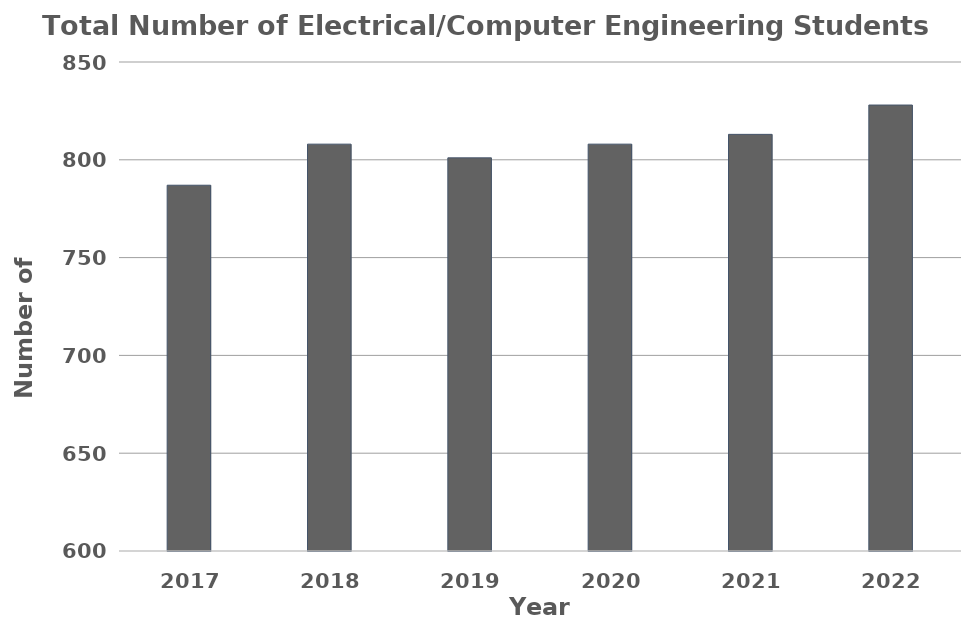
| Category | Total Number of Electrical Engineering Students |
|---|---|
| 2017.0 | 787 |
| 2018.0 | 808 |
| 2019.0 | 801 |
| 2020.0 | 808 |
| 2021.0 | 813 |
| 2022.0 | 828 |